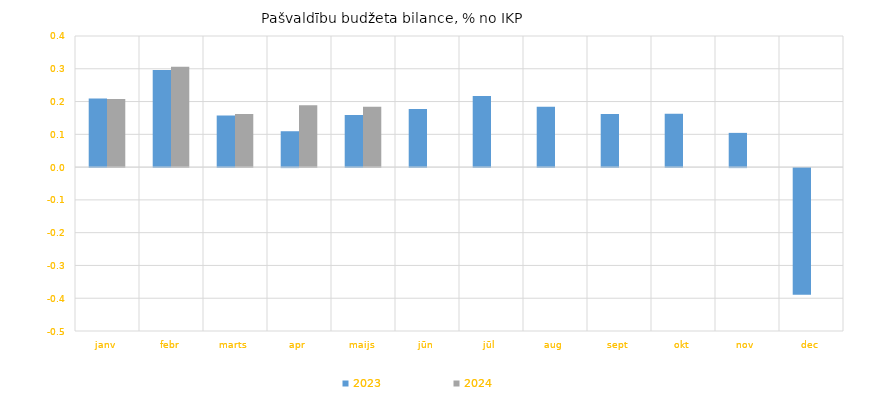
| Category | 2023 | 2024 |
|---|---|---|
| janv | 0.209 | 0.208 |
| febr | 0.296 | 0.306 |
| marts | 0.157 | 0.162 |
| apr | 0.109 | 0.189 |
| maijs | 0.159 | 0.184 |
| jūn | 0.177 | 0 |
| jūl | 0.217 | 0 |
| aug | 0.184 | 0 |
| sept | 0.162 | 0 |
| okt | 0.163 | 0 |
| nov | 0.104 | 0 |
| dec | -0.387 | 0 |